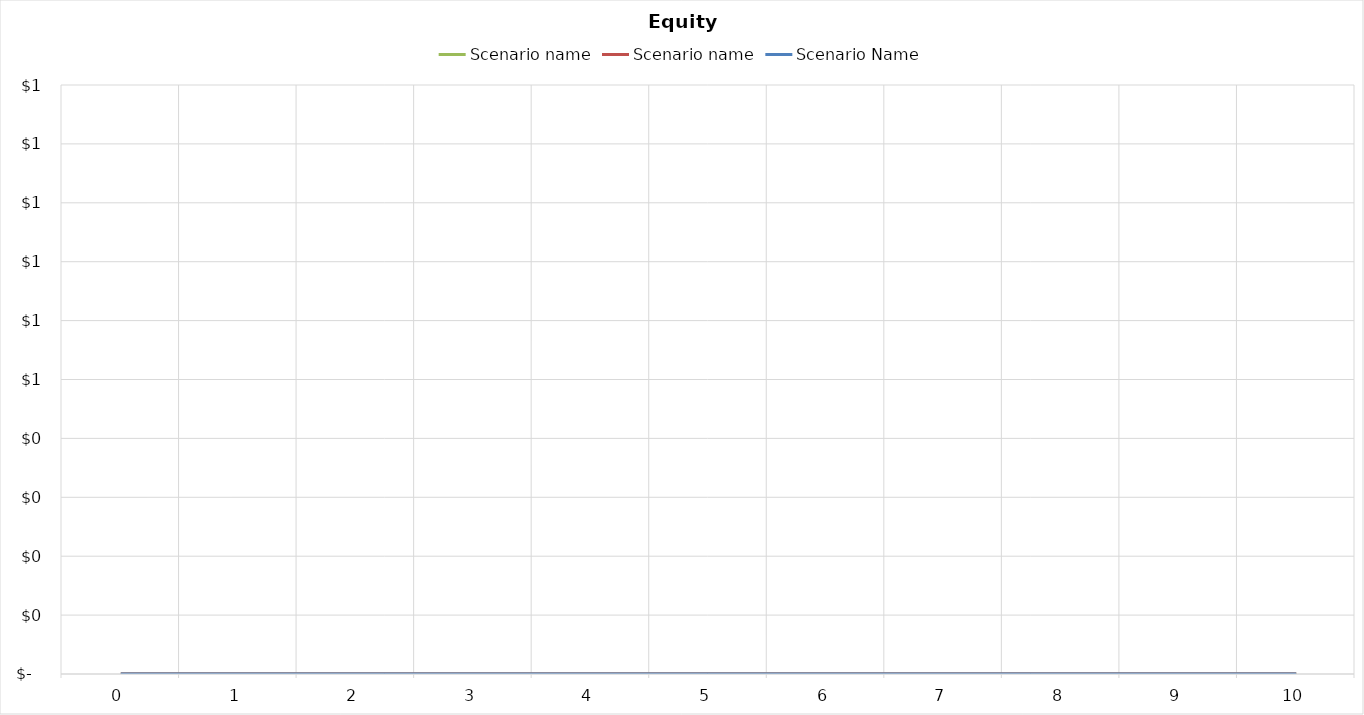
| Category | Scenario name | Scenario Name |
|---|---|---|
| 0.0 | 0 | 0 |
| 1.0 | 0 | 0 |
| 2.0 | 0 | 0 |
| 3.0 | 0 | 0 |
| 4.0 | 0 | 0 |
| 5.0 | 0 | 0 |
| 6.0 | 0 | 0 |
| 7.0 | 0 | 0 |
| 8.0 | 0 | 0 |
| 9.0 | 0 | 0 |
| 10.0 | 0 | 0 |